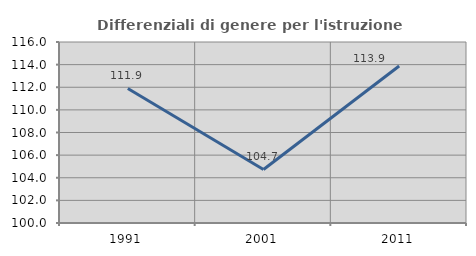
| Category | Differenziali di genere per l'istruzione superiore |
|---|---|
| 1991.0 | 111.89 |
| 2001.0 | 104.733 |
| 2011.0 | 113.884 |